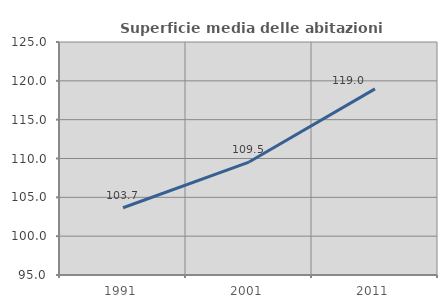
| Category | Superficie media delle abitazioni occupate |
|---|---|
| 1991.0 | 103.657 |
| 2001.0 | 109.542 |
| 2011.0 | 118.96 |